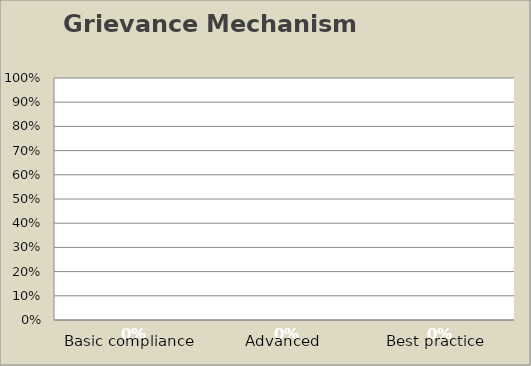
| Category | Grievance Mechanism |
|---|---|
| Basic compliance | 0 |
| Advanced | 0 |
| Best practice | 0 |